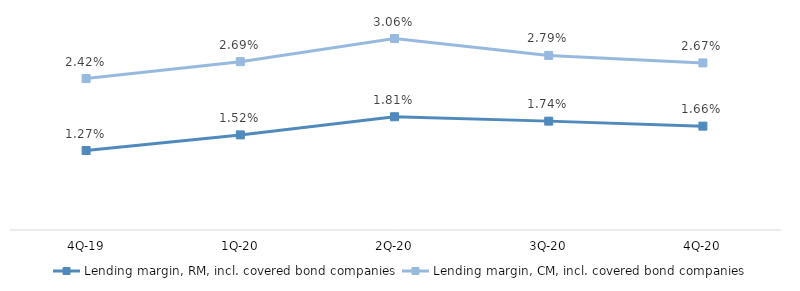
| Category | Lending margin, RM, incl. covered bond companies | Lending margin, CM, incl. covered bond companies |
|---|---|---|
| 4Q-20 | 0.017 | 0.027 |
| 3Q-20 | 0.017 | 0.028 |
| 2Q-20 | 0.018 | 0.031 |
| 1Q-20 | 0.015 | 0.027 |
| 4Q-19 | 0.013 | 0.024 |